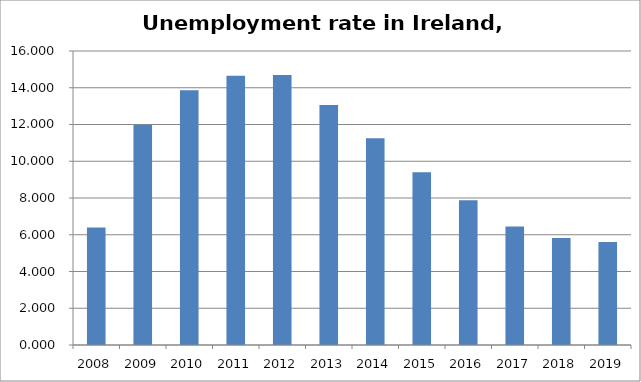
| Category |   Unemployment rate |
|---|---|
| 2008 | 6.4 |
| 2009 | 11.988 |
| 2010 | 13.869 |
| 2011 | 14.65 |
| 2012 | 14.69 |
| 2013 | 13.061 |
| 2014 | 11.254 |
| 2015 | 9.398 |
| 2016 | 7.878 |
| 2017 | 6.45 |
| 2018 | 5.823 |
| 2019 | 5.606 |